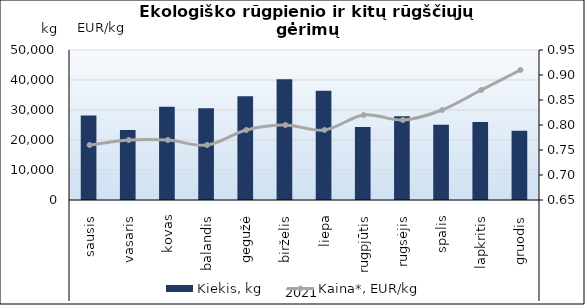
| Category | Kiekis, kg |
|---|---|
| 0 | 28130 |
| 1 | 23293 |
| 2 | 31096 |
| 3 | 30622 |
| 4 | 34615 |
| 5 | 40209 |
| 6 | 36443 |
| 7 | 24356 |
| 8 | 27930 |
| 9 | 25060 |
| 10 | 26009 |
| 11 | 23099 |